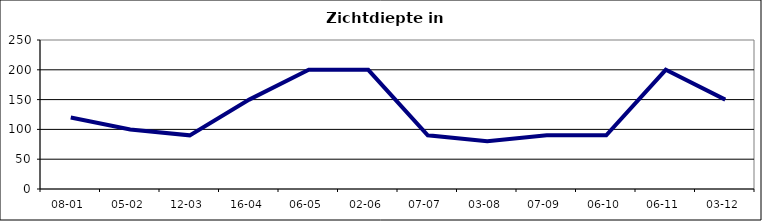
| Category | Zichtdiepte in cm |
|---|---|
| 08-01 | 120 |
| 05-02 | 100 |
| 12-03 | 90 |
| 16-04 | 150 |
| 06-05 | 200 |
| 02-06 | 200 |
| 07-07 | 90 |
| 03-08 | 80 |
| 07-09 | 90 |
| 06-10 | 90 |
| 06-11 | 200 |
| 03-12 | 150 |